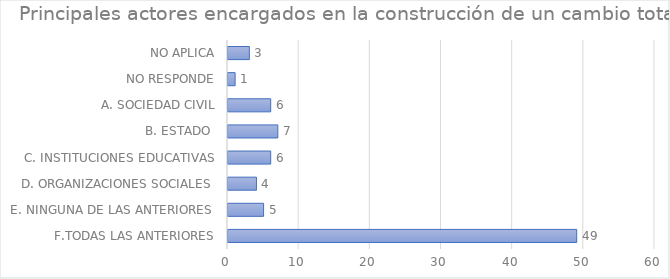
| Category | Series 0 |
|---|---|
| F.TODAS LAS ANTERIORES | 49 |
| E. NINGUNA DE LAS ANTERIORES  | 5 |
| D. ORGANIZACIONES SOCIALES  | 4 |
| C. INSTITUCIONES EDUCATIVAS | 6 |
| B. ESTADO  | 7 |
| A. SOCIEDAD CIVIL | 6 |
| NO RESPONDE | 1 |
| NO APLICA | 3 |